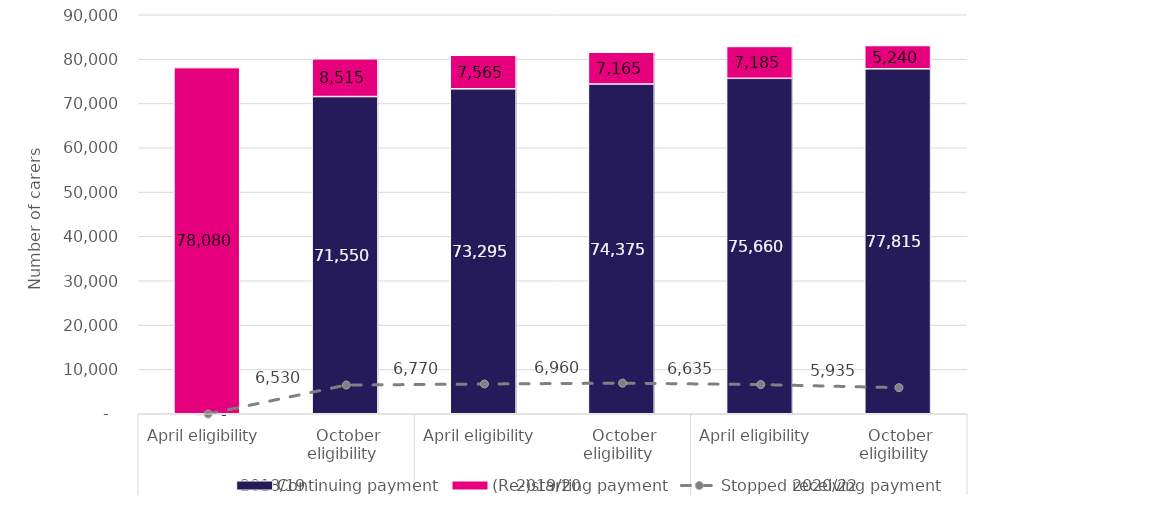
| Category | Continuing payment | (Re-)starting payment |
|---|---|---|
| 0 | 0 | 78080 |
| 1 | 71550 | 8515 |
| 2 | 73295 | 7565 |
| 3 | 74375 | 7165 |
| 4 | 75660 | 7185 |
| 5 | 77815 | 5240 |